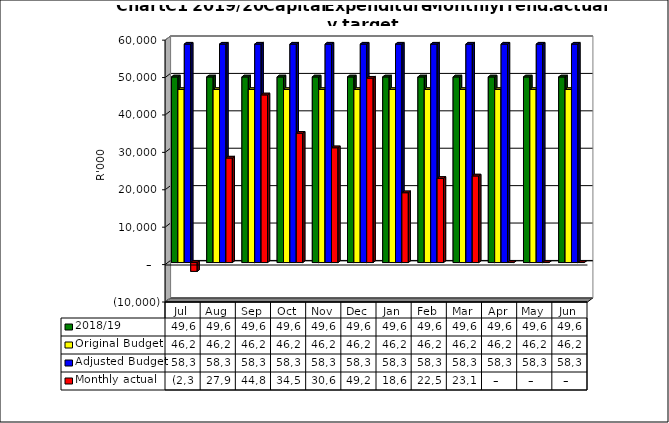
| Category | 2018/19 | Original Budget | Adjusted Budget | Monthly actual |
|---|---|---|---|---|
| Jul | 49622169.308 | 46259409.917 | 58394184.533 | -2354849.52 |
| Aug | 49622169.308 | 46259409.917 | 58394184.533 | 27946048.88 |
| Sep | 49622169.308 | 46259409.917 | 58394184.533 | 44817031.05 |
| Oct | 49622169.308 | 46259409.917 | 58394184.533 | 34585671.62 |
| Nov | 49622169.308 | 46259409.917 | 58394184.533 | 30684238.44 |
| Dec | 49622169.308 | 46259409.917 | 58394184.533 | 49297719.75 |
| Jan | 49622169.308 | 46259409.917 | 58394184.533 | 18669297.1 |
| Feb | 49622169.308 | 46259409.917 | 58394184.533 | 22500413.45 |
| Mar | 49622169.308 | 46259409.917 | 58394184.533 | 23150031.02 |
| Apr | 49622169.308 | 46259409.917 | 58394184.533 | 0 |
| May | 49622169.308 | 46259409.917 | 58394184.533 | 0 |
| Jun | 49622169.308 | 46259409.917 | 58394184.533 | 0 |